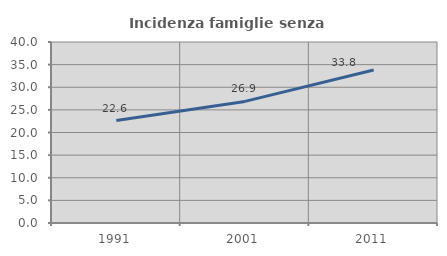
| Category | Incidenza famiglie senza nuclei |
|---|---|
| 1991.0 | 22.628 |
| 2001.0 | 26.874 |
| 2011.0 | 33.824 |